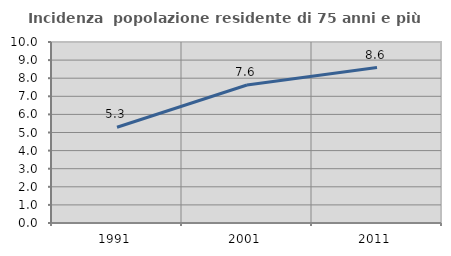
| Category | Incidenza  popolazione residente di 75 anni e più |
|---|---|
| 1991.0 | 5.291 |
| 2001.0 | 7.626 |
| 2011.0 | 8.589 |